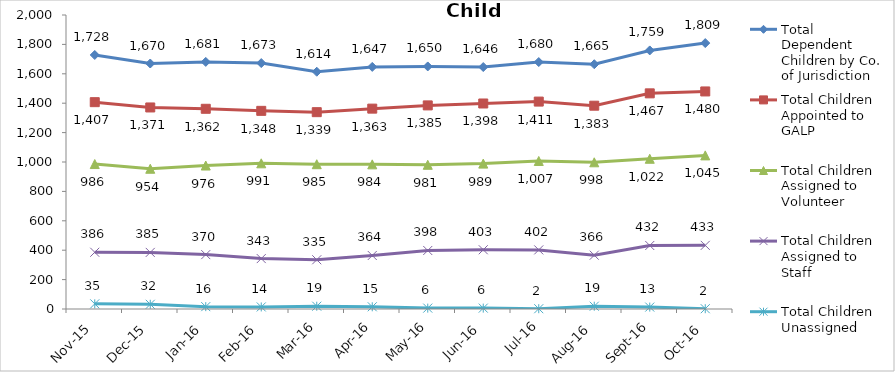
| Category | Total Dependent Children by Co. of Jurisdiction | Total Children Appointed to GALP | Total Children Assigned to Volunteer | Total Children Assigned to Staff | Total Children Unassigned |
|---|---|---|---|---|---|
| Nov-15 | 1728 | 1407 | 986 | 386 | 35 |
| Dec-15 | 1670 | 1371 | 954 | 385 | 32 |
| Jan-16 | 1681 | 1362 | 976 | 370 | 16 |
| Feb-16 | 1673 | 1348 | 991 | 343 | 14 |
| Mar-16 | 1614 | 1339 | 985 | 335 | 19 |
| Apr-16 | 1647 | 1363 | 984 | 364 | 15 |
| May-16 | 1650 | 1385 | 981 | 398 | 6 |
| Jun-16 | 1646 | 1398 | 989 | 403 | 6 |
| Jul-16 | 1680 | 1411 | 1007 | 402 | 2 |
| Aug-16 | 1665 | 1383 | 998 | 366 | 19 |
| Sep-16 | 1759 | 1467 | 1022 | 432 | 13 |
| Oct-16 | 1809 | 1480 | 1045 | 433 | 2 |